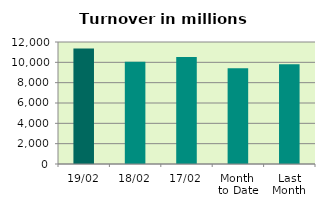
| Category | Series 0 |
|---|---|
| 19/02 | 11366.131 |
| 18/02 | 10067.702 |
| 17/02 | 10529.741 |
| Month 
to Date | 9414.821 |
| Last
Month | 9809.456 |